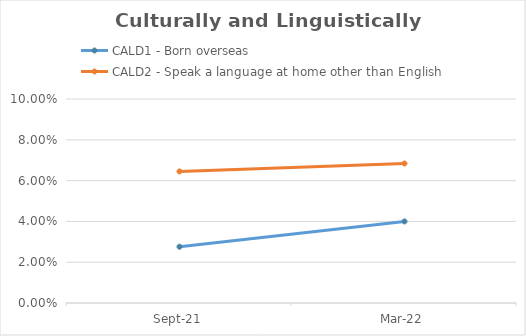
| Category | CALD1 - Born overseas | CALD2 - Speak a language at home other than English |
|---|---|---|
| 2021-09-01 | 0.028 | 0.064 |
| 2022-03-01 | 0.04 | 0.068 |